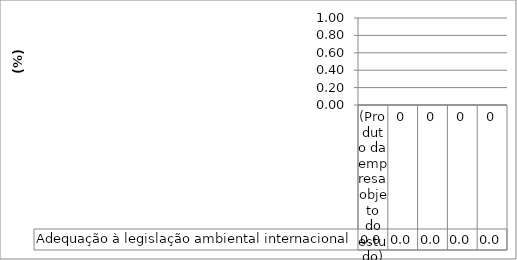
| Category | Adequação à legislação ambiental internacional |
|---|---|
| (Produto da empresa objeto do estudo) | 0 |
| 0 | 0 |
| 0 | 0 |
| 0 | 0 |
| 0 | 0 |